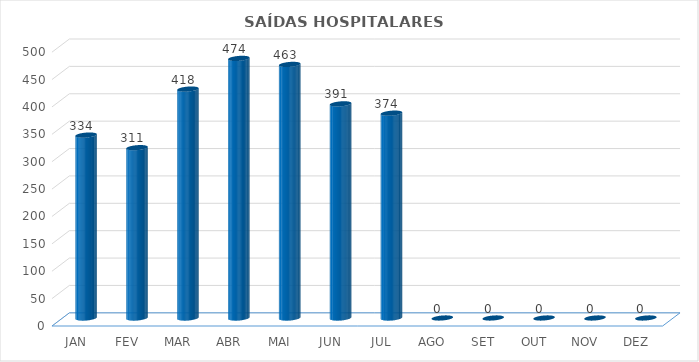
| Category | Series 0 |
|---|---|
| JAN | 334 |
| FEV | 311 |
| MAR | 418 |
| ABR | 474 |
| MAI | 463 |
| JUN | 391 |
| JUL | 374 |
| AGO | 0 |
| SET | 0 |
| OUT | 0 |
| NOV | 0 |
| DEZ | 0 |